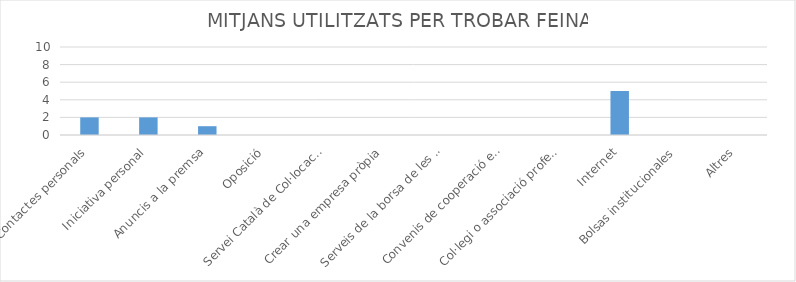
| Category | Series 0 |
|---|---|
| Contactes personals | 2 |
| Iniciativa personal | 2 |
| Anuncis a la premsa | 1 |
| Oposició | 0 |
| Servei Català de Col·locació | 0 |
| Crear una empresa pròpia | 0 |
| Serveis de la borsa de les universitats | 0 |
| Convenis de cooperació educativa | 0 |
| Col·legi o associació professional | 0 |
| Internet | 5 |
| Bolsas institucionales | 0 |
| Altres | 0 |